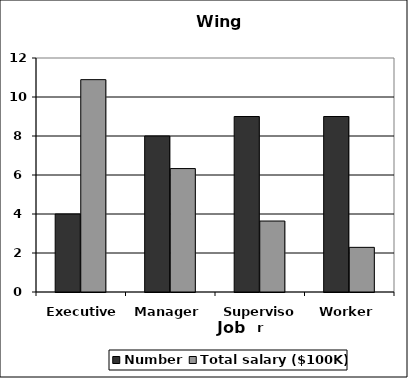
| Category | Number | Total salary ($100K) |
|---|---|---|
| Executive | 4 | 10.89 |
| Manager | 8 | 6.33 |
| Supervisor | 9 | 3.64 |
| Worker | 9 | 2.29 |